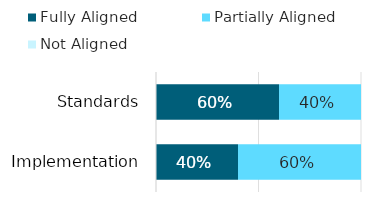
| Category | Fully Aligned | Partially Aligned | Not Aligned |
|---|---|---|---|
| Standards | 0.6 | 0.4 | 0 |
| Implementation | 0.4 | 0.6 | 0 |